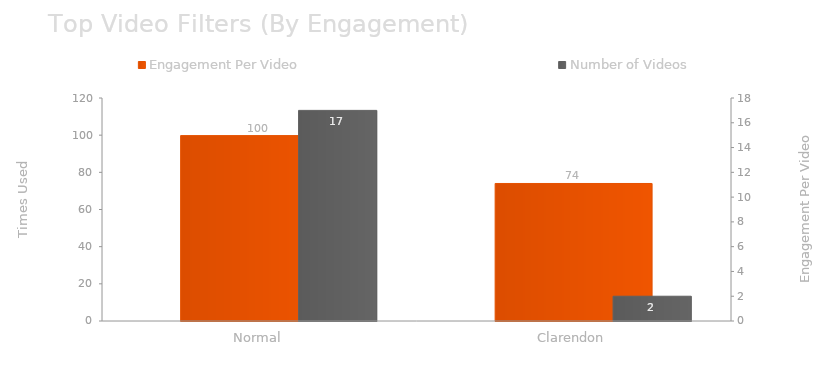
| Category | Engagement Per Video |
|---|---|
| Normal | 99.765 |
| Clarendon | 74 |